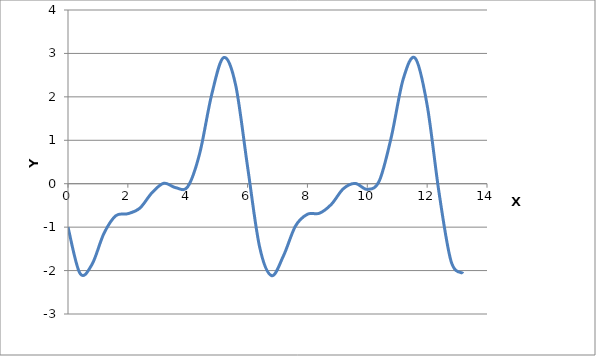
| Category | Series 0 |
|---|---|
| 0.0 | -1 |
| 0.4 | -2.064 |
| 0.8 | -1.861 |
| 1.2000000000000002 | -1.146 |
| 1.6 | -0.737 |
| 2.0 | -0.691 |
| 2.4 | -0.563 |
| 2.8 | -0.213 |
| 3.1999999999999997 | 0.01 |
| 3.5999999999999996 | -0.092 |
| 3.9999999999999996 | -0.069 |
| 4.3999999999999995 | 0.697 |
| 4.8 | 2.049 |
| 5.2 | 2.904 |
| 5.6000000000000005 | 2.277 |
| 6.000000000000001 | 0.391 |
| 6.400000000000001 | -1.448 |
| 6.800000000000002 | -2.116 |
| 7.200000000000002 | -1.659 |
| 7.600000000000002 | -0.975 |
| 8.000000000000002 | -0.703 |
| 8.400000000000002 | -0.68 |
| 8.800000000000002 | -0.474 |
| 9.200000000000003 | -0.116 |
| 9.600000000000003 | 0.007 |
| 10.000000000000004 | -0.131 |
| 10.400000000000004 | 0.063 |
| 10.800000000000004 | 1.067 |
| 11.200000000000005 | 2.408 |
| 11.600000000000005 | 2.892 |
| 12.000000000000005 | 1.81 |
| 12.400000000000006 | -0.217 |
| 12.800000000000006 | -1.787 |
| 13.200000000000006 | -2.066 |